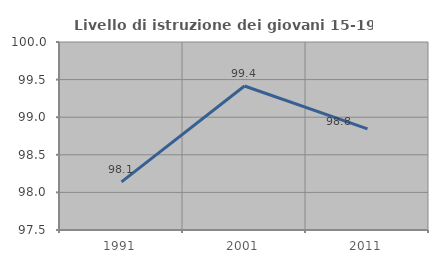
| Category | Livello di istruzione dei giovani 15-19 anni |
|---|---|
| 1991.0 | 98.14 |
| 2001.0 | 99.415 |
| 2011.0 | 98.844 |